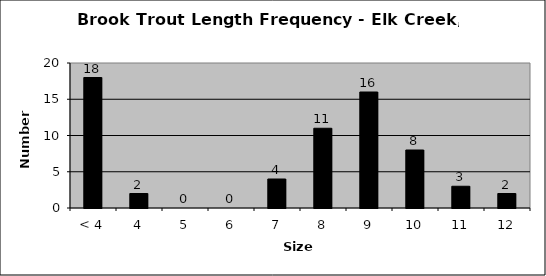
| Category | Series 0 |
|---|---|
| < 4 | 18 |
| 4 | 2 |
| 5 | 0 |
| 6 | 0 |
| 7 | 4 |
| 8 | 11 |
| 9 | 16 |
| 10 | 8 |
| 11 | 3 |
| 12 | 2 |